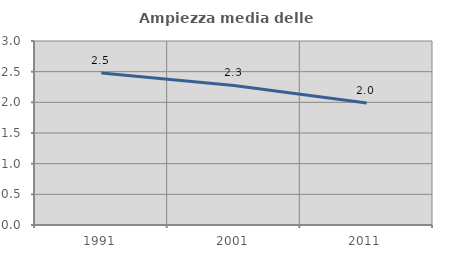
| Category | Ampiezza media delle famiglie |
|---|---|
| 1991.0 | 2.479 |
| 2001.0 | 2.276 |
| 2011.0 | 1.99 |